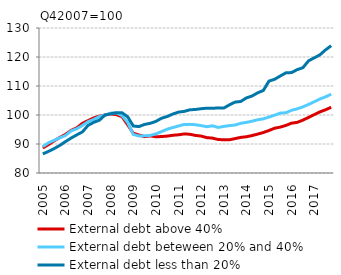
| Category | External debt above 40% | External debt beteween 20% and 40% | External debt less than 20% |
|---|---|---|---|
| 2005 | 88.624 | 89.092 | 86.582 |
|  | 89.795 | 90.408 | 87.451 |
|  | 91.096 | 91.29 | 88.413 |
|  | 92.251 | 92.132 | 89.513 |
| 2006 | 93.3 | 92.909 | 90.82 |
|  | 94.692 | 94.51 | 92.046 |
|  | 95.567 | 95.254 | 93.138 |
|  | 97.122 | 96.394 | 94.166 |
| 2007 | 98.067 | 97.694 | 96.415 |
|  | 98.973 | 98.454 | 97.465 |
|  | 99.614 | 99.445 | 98.199 |
|  | 100 | 100 | 100 |
| 2008 | 100.394 | 100.648 | 100.427 |
|  | 100.121 | 100.698 | 100.79 |
|  | 99.426 | 99.833 | 100.782 |
|  | 96.655 | 97.436 | 99.401 |
| 2009 | 93.727 | 93.31 | 96.206 |
|  | 93.105 | 92.758 | 96.004 |
|  | 92.536 | 92.814 | 96.754 |
|  | 92.802 | 92.973 | 97.135 |
| 2010 | 92.496 | 93.485 | 97.805 |
|  | 92.568 | 94.279 | 98.883 |
|  | 92.723 | 95.104 | 99.478 |
|  | 93.013 | 95.675 | 100.344 |
| 2011 | 93.173 | 96.22 | 101.006 |
|  | 93.472 | 96.744 | 101.242 |
|  | 93.363 | 96.77 | 101.786 |
|  | 92.951 | 96.648 | 101.915 |
| 2012 | 92.735 | 96.331 | 102.165 |
|  | 92.194 | 95.975 | 102.351 |
|  | 92.034 | 96.264 | 102.293 |
|  | 91.552 | 95.713 | 102.463 |
| 2013 | 91.456 | 96.055 | 102.379 |
|  | 91.46 | 96.337 | 103.498 |
|  | 91.858 | 96.539 | 104.442 |
|  | 92.283 | 97.127 | 104.664 |
| 2014 | 92.496 | 97.457 | 105.883 |
|  | 92.905 | 97.858 | 106.551 |
|  | 93.415 | 98.361 | 107.636 |
|  | 93.967 | 98.663 | 108.465 |
| 2015 | 94.655 | 99.302 | 111.684 |
|  | 95.449 | 99.931 | 112.324 |
|  | 95.826 | 100.662 | 113.447 |
|  | 96.42 | 100.779 | 114.545 |
| 2016 | 97.187 | 101.633 | 114.633 |
|  | 97.465 | 102.125 | 115.655 |
|  | 98.239 | 102.8 | 116.311 |
|  | 99.172 | 103.645 | 118.678 |
| 2017 | 100.125 | 104.561 | 119.711 |